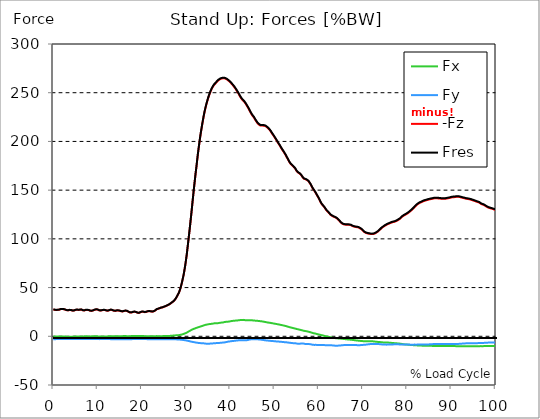
| Category |  Fx |  Fy |  -Fz |  Fres |
|---|---|---|---|---|
| 0.0 | -0.263 | -2.937 | 27.478 | 27.65 |
| 0.167348456675344 | -0.285 | -2.953 | 27.382 | 27.556 |
| 0.334696913350688 | -0.305 | -2.959 | 27.114 | 27.291 |
| 0.5020453700260321 | -0.274 | -2.934 | 26.926 | 27.102 |
| 0.669393826701376 | -0.227 | -2.901 | 26.907 | 27.078 |
| 0.83674228337672 | -0.195 | -2.87 | 27.041 | 27.208 |
| 1.0040907400520642 | -0.202 | -2.847 | 27.119 | 27.282 |
| 1.1621420602454444 | -0.198 | -2.816 | 27.072 | 27.23 |
| 1.3294905169207885 | -0.159 | -2.794 | 27.242 | 27.395 |
| 1.4968389735961325 | -0.131 | -2.794 | 27.544 | 27.693 |
| 1.6641874302714765 | -0.114 | -2.808 | 27.873 | 28.021 |
| 1.8315358869468206 | -0.136 | -2.817 | 27.979 | 28.128 |
| 1.9988843436221646 | -0.165 | -2.829 | 27.942 | 28.094 |
| 2.1662328002975086 | -0.167 | -2.835 | 27.835 | 27.987 |
| 2.333581256972853 | -0.176 | -2.844 | 27.808 | 27.963 |
| 2.5009297136481967 | -0.223 | -2.851 | 27.671 | 27.827 |
| 2.6682781703235405 | -0.298 | -2.855 | 27.35 | 27.51 |
| 2.8356266269988843 | -0.357 | -2.853 | 26.999 | 27.162 |
| 3.002975083674229 | -0.385 | -2.854 | 26.742 | 26.909 |
| 3.1703235403495724 | -0.372 | -2.847 | 26.6 | 26.77 |
| 3.337671997024917 | -0.36 | -2.842 | 26.596 | 26.765 |
| 3.4957233172182973 | -0.36 | -2.853 | 26.795 | 26.965 |
| 3.663071773893641 | -0.363 | -2.867 | 26.975 | 27.145 |
| 3.8304202305689854 | -0.391 | -2.878 | 26.984 | 27.153 |
| 3.997768687244329 | -0.419 | -2.878 | 26.823 | 26.994 |
| 4.165117143919673 | -0.448 | -2.875 | 26.563 | 26.735 |
| 4.332465600595017 | -0.44 | -2.855 | 26.341 | 26.512 |
| 4.499814057270361 | -0.398 | -2.823 | 26.254 | 26.42 |
| 4.667162513945706 | -0.316 | -2.789 | 26.412 | 26.569 |
| 4.834510970621049 | -0.224 | -2.773 | 26.709 | 26.861 |
| 5.001859427296393 | -0.184 | -2.795 | 27.037 | 27.189 |
| 5.169207883971737 | -0.17 | -2.813 | 27.282 | 27.434 |
| 5.336556340647081 | -0.186 | -2.823 | 27.342 | 27.496 |
| 5.503904797322425 | -0.199 | -2.833 | 27.221 | 27.378 |
| 5.671253253997769 | -0.202 | -2.844 | 27.022 | 27.181 |
| 5.82930457419115 | -0.152 | -2.835 | 26.996 | 27.153 |
| 5.996653030866494 | -0.093 | -2.82 | 27.249 | 27.404 |
| 6.164001487541838 | -0.063 | -2.813 | 27.485 | 27.639 |
| 6.331349944217181 | -0.106 | -2.817 | 27.416 | 27.569 |
| 6.498698400892526 | -0.165 | -2.824 | 27.069 | 27.227 |
| 6.66604685756787 | -0.181 | -2.817 | 26.649 | 26.81 |
| 6.833395314243213 | -0.142 | -2.796 | 26.463 | 26.624 |
| 7.000743770918558 | -0.081 | -2.773 | 26.504 | 26.661 |
| 7.168092227593902 | -0.024 | -2.771 | 26.81 | 26.963 |
| 7.335440684269246 | -0.019 | -2.789 | 27.077 | 27.232 |
| 7.50278914094459 | -0.029 | -2.795 | 27.196 | 27.351 |
| 7.6701375976199335 | -0.091 | -2.811 | 27.072 | 27.232 |
| 7.837486054295278 | -0.127 | -2.826 | 26.931 | 27.094 |
| 7.995537374488658 | -0.161 | -2.842 | 26.855 | 27.024 |
| 8.162885831164003 | -0.17 | -2.851 | 26.468 | 26.637 |
| 8.330234287839346 | -0.165 | -2.854 | 26.19 | 26.363 |
| 8.49758274451469 | -0.125 | -2.853 | 26.088 | 26.26 |
| 8.664931201190035 | -0.074 | -2.848 | 26.111 | 26.279 |
| 8.832279657865378 | -0.037 | -2.854 | 26.322 | 26.487 |
| 8.999628114540721 | 0 | -2.851 | 26.531 | 26.692 |
| 9.166976571216066 | 0.052 | -2.85 | 26.848 | 27.006 |
| 9.334325027891412 | 0.088 | -2.847 | 27.206 | 27.363 |
| 9.501673484566755 | 0.086 | -2.854 | 27.4 | 27.555 |
| 9.669021941242098 | 0.075 | -2.847 | 27.556 | 27.709 |
| 9.836370397917442 | 0.034 | -2.86 | 27.58 | 27.736 |
| 10.003718854592787 | -0.049 | -2.889 | 27.423 | 27.586 |
| 10.17106731126813 | -0.146 | -2.917 | 27.046 | 27.215 |
| 10.329118631461512 | -0.199 | -2.92 | 26.647 | 26.822 |
| 10.496467088136853 | -0.199 | -2.912 | 26.454 | 26.631 |
| 10.663815544812199 | -0.183 | -2.904 | 26.382 | 26.559 |
| 10.831164001487544 | -0.158 | -2.889 | 26.491 | 26.667 |
| 10.998512458162887 | -0.134 | -2.889 | 26.704 | 26.878 |
| 11.16586091483823 | -0.118 | -2.898 | 26.959 | 27.133 |
| 11.333209371513574 | -0.133 | -2.9 | 27.013 | 27.189 |
| 11.50055782818892 | -0.145 | -2.888 | 26.932 | 27.106 |
| 11.667906284864264 | -0.156 | -2.889 | 26.912 | 27.084 |
| 11.835254741539607 | -0.177 | -2.892 | 26.706 | 26.881 |
| 12.00260319821495 | -0.176 | -2.907 | 26.412 | 26.59 |
| 12.169951654890292 | -0.147 | -2.907 | 26.249 | 26.428 |
| 12.337300111565641 | -0.081 | -2.9 | 26.24 | 26.416 |
| 12.504648568240984 | -0.032 | -2.886 | 26.422 | 26.594 |
| 12.662699888434362 | 0.022 | -2.888 | 26.746 | 26.914 |
| 12.830048345109708 | 0.044 | -2.913 | 27.091 | 27.26 |
| 12.997396801785053 | 0.038 | -2.938 | 27.279 | 27.448 |
| 13.164745258460396 | 0.015 | -2.954 | 27.15 | 27.323 |
| 13.33209371513574 | -0.031 | -2.991 | 26.882 | 27.063 |
| 13.499442171811083 | -0.063 | -3.027 | 26.525 | 26.715 |
| 13.666790628486426 | -0.053 | -3.04 | 26.221 | 26.416 |
| 13.834139085161771 | -0.019 | -3.038 | 26.068 | 26.264 |
| 14.001487541837117 | 0.018 | -3.034 | 26.062 | 26.258 |
| 14.16883599851246 | 0.046 | -3.034 | 26.217 | 26.412 |
| 14.336184455187803 | 0.059 | -3.044 | 26.441 | 26.636 |
| 14.503532911863147 | 0.043 | -3.049 | 26.515 | 26.711 |
| 14.670881368538492 | 0.021 | -3.05 | 26.425 | 26.622 |
| 14.828932688731873 | 0.007 | -3.066 | 26.381 | 26.581 |
| 14.996281145407215 | -0.003 | -3.056 | 26.218 | 26.417 |
| 15.163629602082558 | -0.01 | -3.055 | 25.931 | 26.13 |
| 15.330978058757903 | 0.029 | -3.047 | 25.631 | 25.832 |
| 15.498326515433247 | 0.068 | -3.021 | 25.481 | 25.676 |
| 15.665674972108594 | 0.131 | -3 | 25.524 | 25.714 |
| 15.833023428783937 | 0.187 | -2.975 | 25.712 | 25.895 |
| 16.00037188545928 | 0.254 | -2.976 | 25.988 | 26.168 |
| 16.167720342134626 | 0.248 | -3.012 | 26.212 | 26.394 |
| 16.335068798809967 | 0.211 | -3.044 | 26.236 | 26.422 |
| 16.502417255485312 | 0.158 | -3.08 | 26.056 | 26.246 |
| 16.669765712160658 | 0.136 | -3.106 | 25.945 | 26.139 |
| 16.837114168836 | 0.086 | -3.115 | 25.581 | 25.78 |
| 17.004462625511344 | 0.034 | -3.112 | 25.115 | 25.319 |
| 17.16251394570472 | 0.022 | -3.09 | 24.673 | 24.879 |
| 17.32986240238007 | 0.053 | -3.055 | 24.379 | 24.583 |
| 17.497210859055414 | 0.131 | -2.999 | 24.237 | 24.435 |
| 17.664559315730756 | 0.214 | -2.945 | 24.369 | 24.558 |
| 17.8319077724061 | 0.301 | -2.903 | 24.658 | 24.839 |
| 17.999256229081443 | 0.379 | -2.879 | 24.963 | 25.14 |
| 18.166604685756788 | 0.382 | -2.888 | 25.174 | 25.35 |
| 18.333953142432133 | 0.36 | -2.895 | 25.23 | 25.407 |
| 18.501301599107478 | 0.317 | -2.904 | 25.152 | 25.329 |
| 18.668650055782823 | 0.251 | -2.914 | 24.885 | 25.066 |
| 18.835998512458165 | 0.199 | -2.909 | 24.527 | 24.709 |
| 19.00334696913351 | 0.159 | -2.891 | 24.161 | 24.344 |
| 19.170695425808855 | 0.176 | -2.863 | 23.96 | 24.142 |
| 19.338043882484197 | 0.233 | -2.823 | 23.972 | 24.147 |
| 19.496095202677576 | 0.289 | -2.798 | 24.246 | 24.419 |
| 19.66344365935292 | 0.341 | -2.785 | 24.605 | 24.773 |
| 19.830792116028263 | 0.351 | -2.813 | 25.012 | 25.181 |
| 19.998140572703612 | 0.33 | -2.832 | 25.224 | 25.395 |
| 20.165489029378953 | 0.274 | -2.857 | 25.313 | 25.485 |
| 20.3328374860543 | 0.211 | -2.879 | 25.173 | 25.35 |
| 20.500185942729644 | 0.165 | -2.881 | 24.95 | 25.127 |
| 20.667534399404985 | 0.119 | -2.882 | 24.726 | 24.906 |
| 20.83488285608033 | 0.131 | -2.881 | 24.796 | 24.975 |
| 21.002231312755672 | 0.143 | -2.895 | 25.038 | 25.217 |
| 21.16957976943102 | 0.147 | -2.929 | 25.341 | 25.521 |
| 21.336928226106362 | 0.134 | -2.971 | 25.612 | 25.795 |
| 21.504276682781704 | 0.096 | -3.006 | 25.736 | 25.923 |
| 21.67162513945705 | 0.04 | -3.025 | 25.696 | 25.888 |
| 21.82967645965043 | 0.004 | -3.043 | 25.659 | 25.853 |
| 21.997024916325774 | -0.028 | -3.058 | 25.58 | 25.774 |
| 22.16437337300112 | -0.055 | -3.055 | 25.381 | 25.578 |
| 22.33172182967646 | -0.063 | -3.046 | 25.257 | 25.453 |
| 22.499070286351806 | -0.004 | -3.015 | 25.391 | 25.581 |
| 22.666418743027148 | 0.056 | -2.991 | 25.588 | 25.774 |
| 22.833767199702496 | 0.108 | -2.981 | 25.9 | 26.083 |
| 23.00111565637784 | 0.155 | -2.984 | 26.409 | 26.587 |
| 23.168464113053183 | 0.183 | -3.015 | 27.075 | 27.254 |
| 23.335812569728528 | 0.168 | -3.044 | 27.631 | 27.811 |
| 23.50316102640387 | 0.161 | -3.059 | 28.024 | 28.202 |
| 23.670509483079215 | 0.125 | -3.068 | 28.211 | 28.391 |
| 23.83785793975456 | 0.077 | -3.077 | 28.327 | 28.51 |
| 23.995909259947936 | 0.083 | -3.088 | 28.661 | 28.842 |
| 24.163257716623285 | 0.081 | -3.118 | 29.117 | 29.301 |
| 24.330606173298627 | 0.105 | -3.114 | 29.36 | 29.543 |
| 24.49795462997397 | 0.133 | -3.103 | 29.468 | 29.649 |
| 24.665303086649313 | 0.161 | -3.093 | 29.578 | 29.758 |
| 24.83265154332466 | 0.193 | -3.1 | 29.904 | 30.086 |
| 25.0 | 0.235 | -3.099 | 30.274 | 30.453 |
| 25.167348456675345 | 0.265 | -3.09 | 30.581 | 30.758 |
| 25.334696913350694 | 0.285 | -3.084 | 30.801 | 30.976 |
| 25.502045370026035 | 0.282 | -3.103 | 31.285 | 31.46 |
| 25.669393826701377 | 0.283 | -3.088 | 31.522 | 31.695 |
| 25.836742283376722 | 0.298 | -3.078 | 31.845 | 32.016 |
| 26.004090740052067 | 0.326 | -3.075 | 32.245 | 32.416 |
| 26.17143919672741 | 0.353 | -3.074 | 32.647 | 32.819 |
| 26.329490516920792 | 0.401 | -3.072 | 33.096 | 33.267 |
| 26.49683897359613 | 0.465 | -3.068 | 33.621 | 33.794 |
| 26.66418743027148 | 0.535 | -3.066 | 34.257 | 34.429 |
| 26.831535886946828 | 0.609 | -3.063 | 34.805 | 34.978 |
| 26.998884343622166 | 0.68 | -3.062 | 35.347 | 35.521 |
| 27.166232800297514 | 0.752 | -3.072 | 35.971 | 36.146 |
| 27.333581256972852 | 0.823 | -3.09 | 36.634 | 36.811 |
| 27.5009297136482 | 0.894 | -3.109 | 37.326 | 37.504 |
| 27.668278170323543 | 0.947 | -3.142 | 38.637 | 38.817 |
| 27.835626626998888 | 0.954 | -3.176 | 39.937 | 40.118 |
| 28.002975083674233 | 1.009 | -3.202 | 41.248 | 41.431 |
| 28.170323540349575 | 1.09 | -3.23 | 42.743 | 42.925 |
| 28.33767199702492 | 1.171 | -3.28 | 44.122 | 44.307 |
| 28.50502045370026 | 1.283 | -3.357 | 46.062 | 46.251 |
| 28.663071773893645 | 1.45 | -3.394 | 48.255 | 48.448 |
| 28.830420230568986 | 1.586 | -3.493 | 50.776 | 50.975 |
| 28.99776868724433 | 1.754 | -3.593 | 53.735 | 53.938 |
| 29.165117143919673 | 1.95 | -3.684 | 57.049 | 57.26 |
| 29.33246560059502 | 2.233 | -3.733 | 60.453 | 60.673 |
| 29.499814057270367 | 2.468 | -3.876 | 64.19 | 64.42 |
| 29.66716251394571 | 2.755 | -3.997 | 68.481 | 68.723 |
| 29.834510970621054 | 3.086 | -4.111 | 73.208 | 73.46 |
| 30.00185942729639 | 3.42 | -4.257 | 78.478 | 78.74 |
| 30.169207883971744 | 3.801 | -4.376 | 83.973 | 84.249 |
| 30.33655634064708 | 4.217 | -4.59 | 90.54 | 90.832 |
| 30.50390479732243 | 4.724 | -4.726 | 97.075 | 97.391 |
| 30.671253253997772 | 5.152 | -4.894 | 103.605 | 103.944 |
| 30.829304574191156 | 5.599 | -5.086 | 110.23 | 110.591 |
| 30.996653030866494 | 5.956 | -5.327 | 117.239 | 117.619 |
| 31.164001487541842 | 6.44 | -5.463 | 124.364 | 124.765 |
| 31.331349944217187 | 6.839 | -5.628 | 131.677 | 132.093 |
| 31.498698400892525 | 7.186 | -5.796 | 139.223 | 139.649 |
| 31.666046857567874 | 7.485 | -5.932 | 146.462 | 146.894 |
| 31.833395314243212 | 7.77 | -6.058 | 153.58 | 154.018 |
| 32.00074377091856 | 7.997 | -6.204 | 160.401 | 160.845 |
| 32.1680922275939 | 8.311 | -6.358 | 167.171 | 167.624 |
| 32.33544068426925 | 8.646 | -6.479 | 173.232 | 173.696 |
| 32.50278914094459 | 8.906 | -6.599 | 179.901 | 180.37 |
| 32.670137597619934 | 9.146 | -6.733 | 186.398 | 186.87 |
| 32.83748605429528 | 9.369 | -6.855 | 192.323 | 192.802 |
| 33.004834510970625 | 9.637 | -6.937 | 197.923 | 198.41 |
| 33.162885831164004 | 9.912 | -7.018 | 203.45 | 203.942 |
| 33.33023428783935 | 10.119 | -7.047 | 208.472 | 208.965 |
| 33.497582744514695 | 10.319 | -7.071 | 212.993 | 213.488 |
| 33.664931201190036 | 10.581 | -7.068 | 217.55 | 218.052 |
| 33.83227965786538 | 10.863 | -7.114 | 221.92 | 222.432 |
| 33.99962811454073 | 11.162 | -7.242 | 226.009 | 226.535 |
| 34.16697657121607 | 11.454 | -7.404 | 229.813 | 230.355 |
| 34.33432502789141 | 11.683 | -7.491 | 233.112 | 233.665 |
| 34.50167348456676 | 11.863 | -7.571 | 236.223 | 236.783 |
| 34.6690219412421 | 12.001 | -7.609 | 239.137 | 239.701 |
| 34.83637039791744 | 12.142 | -7.621 | 241.836 | 242.403 |
| 35.00371885459279 | 12.308 | -7.627 | 244.37 | 244.94 |
| 35.17106731126814 | 12.426 | -7.6 | 246.678 | 247.249 |
| 35.338415767943474 | 12.543 | -7.56 | 248.823 | 249.395 |
| 35.49646708813686 | 12.643 | -7.499 | 250.779 | 251.353 |
| 35.6638155448122 | 12.737 | -7.429 | 252.584 | 253.156 |
| 35.831164001487544 | 12.833 | -7.355 | 254.178 | 254.751 |
| 35.998512458162885 | 12.965 | -7.31 | 255.578 | 256.153 |
| 36.165860914838234 | 13.117 | -7.265 | 256.853 | 257.432 |
| 36.333209371513576 | 13.248 | -7.201 | 257.994 | 258.575 |
| 36.50055782818892 | 13.366 | -7.131 | 258.944 | 259.529 |
| 36.667906284864266 | 13.324 | -7.038 | 259.591 | 260.17 |
| 36.83525474153961 | 13.286 | -6.993 | 260.379 | 260.95 |
| 37.002603198214956 | 13.322 | -6.976 | 261.388 | 261.956 |
| 37.1699516548903 | 13.422 | -6.912 | 262.198 | 262.767 |
| 37.337300111565646 | 13.541 | -6.851 | 262.853 | 263.425 |
| 37.50464856824098 | 13.678 | -6.786 | 263.372 | 263.945 |
| 37.66269988843437 | 13.866 | -6.757 | 263.86 | 264.441 |
| 37.83004834510971 | 14.003 | -6.696 | 264.226 | 264.81 |
| 37.99739680178505 | 14.049 | -6.591 | 264.51 | 265.093 |
| 38.16474525846039 | 14.08 | -6.507 | 264.72 | 265.299 |
| 38.33209371513574 | 14.174 | -6.456 | 264.848 | 265.428 |
| 38.49944217181109 | 14.413 | -6.383 | 264.898 | 265.485 |
| 38.666790628486424 | 14.577 | -6.301 | 264.792 | 265.385 |
| 38.83413908516178 | 14.714 | -6.168 | 264.569 | 265.165 |
| 39.001487541837115 | 14.817 | -6.016 | 264.242 | 264.839 |
| 39.16883599851246 | 14.873 | -5.847 | 263.811 | 264.407 |
| 39.336184455187805 | 14.919 | -5.701 | 263.354 | 263.95 |
| 39.503532911863154 | 14.954 | -5.471 | 262.779 | 263.372 |
| 39.670881368538495 | 15.094 | -5.339 | 262.134 | 262.73 |
| 39.83822982521384 | 15.264 | -5.294 | 261.487 | 262.09 |
| 39.996281145407224 | 15.409 | -5.193 | 260.764 | 261.373 |
| 40.163629602082565 | 15.556 | -5.047 | 259.903 | 260.518 |
| 40.33097805875791 | 15.684 | -4.947 | 259.043 | 259.664 |
| 40.498326515433256 | 15.805 | -4.858 | 258.19 | 258.816 |
| 40.6656749721086 | 15.886 | -4.788 | 257.252 | 257.881 |
| 40.83302342878393 | 15.951 | -4.724 | 256.277 | 256.91 |
| 41.00037188545929 | 16.016 | -4.65 | 255.285 | 255.92 |
| 41.16772034213463 | 16.086 | -4.528 | 254.187 | 254.827 |
| 41.33506879880997 | 16.156 | -4.409 | 253.012 | 253.658 |
| 41.50241725548531 | 16.22 | -4.332 | 251.811 | 252.465 |
| 41.66976571216066 | 16.295 | -4.258 | 250.605 | 251.264 |
| 41.837114168836 | 16.37 | -4.167 | 249.353 | 250.018 |
| 42.004462625511344 | 16.524 | -4.055 | 247.891 | 248.565 |
| 42.17181108218669 | 16.609 | -3.993 | 246.541 | 247.223 |
| 42.32986240238007 | 16.668 | -3.981 | 245.223 | 245.91 |
| 42.497210859055414 | 16.718 | -3.969 | 243.993 | 244.683 |
| 42.66455931573076 | 16.789 | -3.997 | 243.13 | 243.826 |
| 42.831907772406105 | 16.87 | -4.04 | 242.211 | 242.914 |
| 42.999256229081446 | 16.845 | -4.074 | 241.441 | 242.143 |
| 43.16660468575679 | 16.695 | -4.08 | 240.655 | 241.344 |
| 43.33395314243214 | 16.569 | -4.093 | 239.785 | 240.465 |
| 43.50130159910748 | 16.55 | -4.133 | 238.553 | 239.235 |
| 43.66865005578282 | 16.469 | -4.081 | 237.299 | 237.976 |
| 43.83599851245817 | 16.398 | -3.945 | 236.037 | 236.709 |
| 44.00334696913351 | 16.355 | -3.773 | 234.796 | 235.465 |
| 44.17069542580886 | 16.369 | -3.575 | 233.401 | 234.069 |
| 44.3380438824842 | 16.413 | -3.376 | 231.957 | 232.627 |
| 44.49609520267758 | 16.42 | -3.215 | 230.506 | 231.176 |
| 44.66344365935292 | 16.369 | -3.114 | 229.043 | 229.711 |
| 44.83079211602827 | 16.358 | -3.037 | 227.761 | 228.431 |
| 44.99814057270361 | 16.357 | -2.985 | 226.552 | 227.224 |
| 45.16548902937895 | 16.294 | -3.056 | 225.594 | 226.265 |
| 45.332837486054295 | 16.195 | -3.137 | 224.69 | 225.357 |
| 45.500185942729644 | 16.097 | -3.189 | 223.338 | 224.001 |
| 45.66753439940499 | 16.046 | -3.102 | 222.086 | 222.746 |
| 45.83488285608033 | 15.991 | -3.062 | 220.895 | 221.556 |
| 46.00223131275568 | 15.929 | -3.052 | 219.742 | 220.401 |
| 46.16957976943102 | 15.851 | -3.108 | 218.673 | 219.33 |
| 46.336928226106366 | 15.767 | -3.18 | 217.814 | 218.469 |
| 46.50427668278171 | 15.673 | -3.245 | 217.235 | 217.885 |
| 46.671625139457056 | 15.58 | -3.299 | 216.705 | 217.353 |
| 46.829676459650436 | 15.487 | -3.363 | 216.251 | 216.892 |
| 46.99702491632577 | 15.394 | -3.487 | 216.245 | 216.882 |
| 47.16437337300112 | 15.289 | -3.606 | 216.271 | 216.904 |
| 47.33172182967646 | 15.173 | -3.723 | 216.333 | 216.959 |
| 47.49907028635181 | 15.037 | -3.832 | 216.183 | 216.802 |
| 47.66641874302716 | 14.888 | -3.945 | 216.018 | 216.631 |
| 47.83376719970249 | 14.739 | -4.069 | 215.969 | 216.575 |
| 48.001115656377834 | 14.587 | -4.174 | 215.608 | 216.208 |
| 48.16846411305319 | 14.434 | -4.268 | 215.074 | 215.668 |
| 48.33581256972853 | 14.28 | -4.363 | 214.54 | 215.128 |
| 48.50316102640387 | 14.149 | -4.428 | 213.814 | 214.4 |
| 48.67050948307921 | 14.025 | -4.487 | 213.043 | 213.625 |
| 48.837857939754564 | 13.912 | -4.572 | 212.196 | 212.777 |
| 49.005206396429905 | 13.805 | -4.674 | 211.313 | 211.892 |
| 49.163257716623285 | 13.656 | -4.774 | 210.195 | 210.774 |
| 49.33060617329863 | 13.506 | -4.805 | 208.909 | 209.481 |
| 49.49795462997397 | 13.378 | -4.833 | 207.795 | 208.361 |
| 49.66530308664932 | 13.24 | -4.904 | 206.724 | 207.288 |
| 49.832651543324666 | 13.081 | -5.015 | 205.642 | 206.201 |
| 50.0 | 12.96 | -5.08 | 204.428 | 204.982 |
| 50.16734845667534 | 12.835 | -5.15 | 203.236 | 203.788 |
| 50.33469691335069 | 12.698 | -5.23 | 202.062 | 202.612 |
| 50.50204537002604 | 12.54 | -5.298 | 200.773 | 201.316 |
| 50.66939382670139 | 12.392 | -5.348 | 199.493 | 200.028 |
| 50.836742283376715 | 12.236 | -5.435 | 198.271 | 198.804 |
| 51.00409074005207 | 12.105 | -5.462 | 197.066 | 197.596 |
| 51.17143919672741 | 11.959 | -5.522 | 195.997 | 196.522 |
| 51.32949051692079 | 11.796 | -5.59 | 194.642 | 195.161 |
| 51.496838973596134 | 11.606 | -5.677 | 193.347 | 193.857 |
| 51.66418743027148 | 11.426 | -5.746 | 192.134 | 192.637 |
| 51.831535886946824 | 11.24 | -5.838 | 190.999 | 191.496 |
| 51.99888434362217 | 11.125 | -5.87 | 189.869 | 190.363 |
| 52.16623280029752 | 10.962 | -5.966 | 188.65 | 189.139 |
| 52.33358125697285 | 10.761 | -6.091 | 187.392 | 187.876 |
| 52.5009297136482 | 10.578 | -6.114 | 186.174 | 186.65 |
| 52.668278170323546 | 10.358 | -6.174 | 184.696 | 185.164 |
| 52.835626626998895 | 10.136 | -6.289 | 183.308 | 183.77 |
| 53.00297508367424 | 9.909 | -6.391 | 181.959 | 182.412 |
| 53.17032354034958 | 9.684 | -6.478 | 180.563 | 181.007 |
| 53.33767199702492 | 9.431 | -6.588 | 179.037 | 179.469 |
| 53.50502045370027 | 9.237 | -6.684 | 177.894 | 178.322 |
| 53.663071773893655 | 9.053 | -6.779 | 176.845 | 177.27 |
| 53.83042023056899 | 8.86 | -6.873 | 176.174 | 176.596 |
| 53.99776868724433 | 8.686 | -6.954 | 175.41 | 175.83 |
| 54.16511714391967 | 8.506 | -7.069 | 174.553 | 174.976 |
| 54.33246560059503 | 8.314 | -7.115 | 173.858 | 174.277 |
| 54.49981405727037 | 8.124 | -7.133 | 173.114 | 173.527 |
| 54.667162513945705 | 7.935 | -7.159 | 172.261 | 172.67 |
| 54.834510970621054 | 7.726 | -7.227 | 170.985 | 171.386 |
| 55.0018594272964 | 7.494 | -7.413 | 169.625 | 170.021 |
| 55.169207883971744 | 7.302 | -7.571 | 168.646 | 169.044 |
| 55.336556340647086 | 7.15 | -7.701 | 168.015 | 168.416 |
| 55.50390479732243 | 6.948 | -7.704 | 167.606 | 168.001 |
| 55.671253253997776 | 6.782 | -7.647 | 167.146 | 167.534 |
| 55.83860171067312 | 6.643 | -7.55 | 166.645 | 167.025 |
| 55.9966530308665 | 6.442 | -7.438 | 165.701 | 166.071 |
| 56.16400148754184 | 6.221 | -7.397 | 164.504 | 164.867 |
| 56.33134994421718 | 5.994 | -7.361 | 163.41 | 163.764 |
| 56.498698400892536 | 5.805 | -7.422 | 162.413 | 162.768 |
| 56.66604685756788 | 5.622 | -7.562 | 161.686 | 162.046 |
| 56.83339531424321 | 5.462 | -7.783 | 161.348 | 161.715 |
| 57.00074377091856 | 5.344 | -7.912 | 161.189 | 161.562 |
| 57.16809222759391 | 5.218 | -7.934 | 160.892 | 161.264 |
| 57.33544068426925 | 5.08 | -7.879 | 160.441 | 160.808 |
| 57.5027891409446 | 4.904 | -7.879 | 159.904 | 160.27 |
| 57.670137597619934 | 4.72 | -7.894 | 159.304 | 159.673 |
| 57.83748605429528 | 4.518 | -7.976 | 158.206 | 158.575 |
| 58.004834510970625 | 4.316 | -8.108 | 157.137 | 157.512 |
| 58.16288583116401 | 4.094 | -8.229 | 155.925 | 156.302 |
| 58.330234287839346 | 3.842 | -8.345 | 154.463 | 154.841 |
| 58.497582744514695 | 3.569 | -8.518 | 153 | 153.379 |
| 58.66493120119004 | 3.316 | -8.712 | 151.65 | 152.029 |
| 58.832279657865385 | 3.167 | -8.836 | 150.56 | 150.942 |
| 58.999628114540734 | 2.999 | -8.836 | 149.419 | 149.801 |
| 59.16697657121607 | 2.829 | -8.836 | 148.279 | 148.659 |
| 59.33432502789142 | 2.678 | -8.792 | 147.009 | 147.383 |
| 59.50167348456676 | 2.469 | -8.789 | 145.645 | 146.012 |
| 59.66902194124211 | 2.227 | -8.873 | 144.271 | 144.64 |
| 59.83637039791745 | 2.047 | -8.963 | 143.078 | 143.453 |
| 60.00371885459278 | 1.867 | -8.987 | 141.615 | 141.99 |
| 60.17106731126813 | 1.733 | -8.969 | 140.137 | 140.51 |
| 60.33841576794349 | 1.501 | -8.962 | 138.499 | 138.87 |
| 60.49646708813685 | 1.311 | -8.904 | 137.052 | 137.42 |
| 60.6638155448122 | 1.145 | -8.845 | 135.757 | 136.124 |
| 60.831164001487544 | 1.013 | -8.792 | 134.83 | 135.195 |
| 60.99851245816289 | 0.801 | -8.867 | 133.978 | 134.342 |
| 61.16586091483824 | 0.574 | -8.969 | 133.14 | 133.506 |
| 61.333209371513576 | 0.322 | -9.072 | 132.119 | 132.487 |
| 61.50055782818892 | 0.147 | -9.125 | 130.932 | 131.302 |
| 61.667906284864266 | -0.058 | -9.133 | 129.791 | 130.161 |
| 61.835254741539615 | -0.208 | -9.13 | 128.881 | 129.251 |
| 62.002603198214956 | -0.341 | -9.145 | 128.084 | 128.457 |
| 62.16995165489029 | -0.54 | -9.183 | 127.285 | 127.659 |
| 62.33730011156564 | -0.709 | -9.226 | 126.532 | 126.912 |
| 62.504648568240995 | -0.836 | -9.243 | 125.602 | 125.988 |
| 62.67199702491633 | -0.993 | -9.227 | 124.705 | 125.091 |
| 62.83004834510971 | -1.149 | -9.23 | 124.131 | 124.521 |
| 62.99739680178505 | -1.299 | -9.301 | 123.678 | 124.074 |
| 63.1647452584604 | -1.447 | -9.385 | 123.221 | 123.622 |
| 63.33209371513575 | -1.591 | -9.465 | 122.858 | 123.268 |
| 63.4994421718111 | -1.735 | -9.544 | 122.516 | 122.934 |
| 63.666790628486424 | -1.86 | -9.619 | 122.211 | 122.636 |
| 63.83413908516177 | -1.947 | -9.681 | 121.906 | 122.338 |
| 64.00148754183712 | -2.028 | -9.72 | 121.37 | 121.807 |
| 64.16883599851248 | -2.1 | -9.692 | 120.714 | 121.152 |
| 64.3361844551878 | -2.149 | -9.624 | 120.137 | 120.574 |
| 64.50353291186315 | -2.192 | -9.559 | 119.388 | 119.823 |
| 64.6708813685385 | -2.24 | -9.499 | 118.515 | 118.947 |
| 64.83822982521384 | -2.348 | -9.447 | 117.677 | 118.108 |
| 65.00557828188919 | -2.444 | -9.37 | 116.794 | 117.221 |
| 65.16362960208257 | -2.509 | -9.26 | 116.075 | 116.497 |
| 65.3309780587579 | -2.609 | -9.187 | 115.544 | 115.963 |
| 65.49832651543326 | -2.712 | -9.103 | 115.165 | 115.58 |
| 65.6656749721086 | -2.791 | -9.047 | 114.886 | 115.299 |
| 65.83302342878395 | -2.854 | -9.01 | 114.696 | 115.108 |
| 66.00037188545929 | -2.928 | -8.981 | 114.617 | 115.027 |
| 66.16772034213463 | -3.032 | -8.945 | 114.617 | 115.027 |
| 66.33506879880998 | -3.127 | -8.953 | 114.519 | 114.931 |
| 66.50241725548531 | -3.187 | -8.941 | 114.466 | 114.878 |
| 66.66976571216065 | -3.257 | -8.92 | 114.476 | 114.888 |
| 66.83711416883601 | -3.32 | -8.904 | 114.466 | 114.878 |
| 67.00446262551135 | -3.378 | -8.9 | 114.406 | 114.819 |
| 67.1718110821867 | -3.45 | -8.912 | 114.211 | 114.627 |
| 67.32986240238007 | -3.535 | -8.928 | 113.962 | 114.383 |
| 67.49721085905541 | -3.655 | -8.944 | 113.501 | 113.929 |
| 67.66455931573076 | -3.723 | -8.971 | 113.038 | 113.472 |
| 67.83190777240611 | -3.822 | -8.954 | 112.746 | 113.183 |
| 67.99925622908145 | -3.938 | -8.925 | 112.555 | 112.994 |
| 68.16660468575678 | -4.066 | -8.951 | 112.395 | 112.842 |
| 68.33395314243214 | -4.183 | -8.984 | 112.235 | 112.689 |
| 68.50130159910749 | -4.224 | -9.046 | 112.072 | 112.534 |
| 68.66865005578282 | -4.286 | -9.088 | 111.972 | 112.441 |
| 68.83599851245816 | -4.375 | -9.108 | 111.898 | 112.373 |
| 69.00334696913352 | -4.512 | -9.105 | 111.674 | 112.156 |
| 69.17069542580886 | -4.553 | -9.096 | 111.295 | 111.78 |
| 69.3380438824842 | -4.67 | -9.108 | 110.798 | 111.292 |
| 69.50539233915956 | -4.76 | -9.024 | 110.324 | 110.819 |
| 69.66344365935292 | -4.888 | -8.972 | 109.829 | 110.326 |
| 69.83079211602826 | -4.951 | -8.913 | 109.088 | 109.587 |
| 69.99814057270362 | -4.982 | -8.845 | 108.351 | 108.85 |
| 70.16548902937896 | -5.003 | -8.785 | 107.521 | 108.019 |
| 70.33283748605429 | -5.001 | -8.715 | 106.892 | 107.389 |
| 70.50018594272964 | -5.012 | -8.649 | 106.442 | 106.935 |
| 70.667534399405 | -5.032 | -8.572 | 106.106 | 106.596 |
| 70.83488285608033 | -4.993 | -8.463 | 105.802 | 106.28 |
| 71.00223131275568 | -4.976 | -8.354 | 105.621 | 106.09 |
| 71.16957976943102 | -5 | -8.233 | 105.516 | 105.975 |
| 71.33692822610637 | -5.027 | -8.134 | 105.341 | 105.794 |
| 71.50427668278171 | -5.038 | -8.069 | 105.125 | 105.574 |
| 71.67162513945706 | -5.05 | -8.013 | 105.049 | 105.493 |
| 71.8389735961324 | -5.08 | -7.945 | 104.993 | 105.432 |
| 71.99702491632577 | -5.133 | -7.898 | 104.907 | 105.345 |
| 72.16437337300113 | -5.189 | -7.861 | 104.833 | 105.271 |
| 72.33172182967647 | -5.237 | -7.819 | 104.978 | 105.414 |
| 72.49907028635181 | -5.335 | -7.829 | 105.242 | 105.683 |
| 72.66641874302715 | -5.422 | -7.829 | 105.515 | 105.959 |
| 72.8337671997025 | -5.478 | -7.798 | 105.823 | 106.267 |
| 73.00111565637783 | -5.586 | -7.847 | 106.351 | 106.801 |
| 73.16846411305319 | -5.681 | -7.888 | 106.853 | 107.307 |
| 73.33581256972853 | -5.77 | -7.92 | 107.33 | 107.792 |
| 73.50316102640387 | -5.811 | -7.975 | 107.962 | 108.426 |
| 73.67050948307921 | -5.867 | -8.044 | 108.664 | 109.134 |
| 73.83785793975457 | -5.984 | -8.155 | 109.534 | 110.015 |
| 74.00520639642991 | -6.009 | -8.214 | 110.17 | 110.653 |
| 74.16325771662328 | -6.099 | -8.291 | 110.942 | 111.434 |
| 74.33060617329863 | -6.209 | -8.354 | 111.572 | 112.072 |
| 74.49795462997398 | -6.283 | -8.394 | 112.118 | 112.622 |
| 74.66530308664932 | -6.317 | -8.468 | 112.569 | 113.08 |
| 74.83265154332466 | -6.395 | -8.525 | 113.063 | 113.58 |
| 75.00000000000001 | -6.429 | -8.546 | 113.617 | 114.136 |
| 75.16734845667534 | -6.454 | -8.622 | 114.021 | 114.546 |
| 75.3346969133507 | -6.471 | -8.572 | 114.485 | 115.007 |
| 75.50204537002605 | -6.46 | -8.484 | 114.886 | 115.401 |
| 75.66939382670138 | -6.466 | -8.426 | 115.251 | 115.763 |
| 75.83674228337672 | -6.499 | -8.413 | 115.587 | 116.099 |
| 76.00409074005208 | -6.556 | -8.429 | 115.839 | 116.355 |
| 76.17143919672742 | -6.634 | -8.444 | 116.184 | 116.704 |
| 76.33878765340276 | -6.723 | -8.426 | 116.547 | 117.068 |
| 76.49683897359614 | -6.795 | -8.392 | 116.789 | 117.31 |
| 76.66418743027148 | -6.886 | -8.326 | 117.055 | 117.577 |
| 76.83153588694682 | -6.945 | -8.305 | 117.233 | 117.757 |
| 76.99888434362218 | -7 | -8.292 | 117.4 | 117.926 |
| 77.16623280029752 | -7.052 | -8.283 | 117.59 | 118.119 |
| 77.33358125697285 | -7.097 | -8.288 | 117.854 | 118.386 |
| 77.5009297136482 | -7.162 | -8.279 | 118.206 | 118.743 |
| 77.66827817032356 | -7.236 | -8.264 | 118.643 | 119.181 |
| 77.83562662699889 | -7.319 | -8.279 | 119.044 | 119.586 |
| 78.00297508367423 | -7.397 | -8.288 | 119.475 | 120.022 |
| 78.17032354034959 | -7.466 | -8.332 | 119.857 | 120.409 |
| 78.33767199702493 | -7.546 | -8.332 | 120.462 | 121.016 |
| 78.50502045370027 | -7.628 | -8.336 | 121.14 | 121.696 |
| 78.67236891037561 | -7.786 | -8.357 | 121.982 | 122.546 |
| 78.83042023056899 | -7.938 | -8.358 | 122.711 | 123.282 |
| 78.99776868724433 | -8.087 | -8.357 | 123.226 | 123.802 |
| 79.16511714391969 | -8.236 | -8.383 | 123.729 | 124.314 |
| 79.33246560059503 | -8.285 | -8.398 | 124.142 | 124.729 |
| 79.49981405727036 | -8.357 | -8.398 | 124.59 | 125.18 |
| 79.66716251394571 | -8.432 | -8.416 | 125.021 | 125.615 |
| 79.83451097062107 | -8.465 | -8.454 | 125.431 | 126.028 |
| 80.00185942729641 | -8.525 | -8.481 | 125.922 | 126.524 |
| 80.16920788397174 | -8.593 | -8.507 | 126.431 | 127.035 |
| 80.33655634064709 | -8.659 | -8.515 | 126.976 | 127.584 |
| 80.50390479732243 | -8.742 | -8.541 | 127.559 | 128.17 |
| 80.67125325399778 | -8.832 | -8.581 | 128.217 | 128.833 |
| 80.83860171067312 | -8.881 | -8.622 | 128.83 | 129.45 |
| 80.99665303086651 | -8.948 | -8.622 | 129.509 | 130.13 |
| 81.16400148754184 | -9.034 | -8.642 | 130.214 | 130.839 |
| 81.3313499442172 | -9.081 | -8.63 | 131.007 | 131.633 |
| 81.49869840089255 | -9.127 | -8.575 | 131.77 | 132.392 |
| 81.66604685756786 | -9.18 | -8.527 | 132.555 | 133.173 |
| 81.83339531424322 | -9.229 | -8.58 | 133.389 | 134.012 |
| 82.00074377091858 | -9.277 | -8.596 | 134.165 | 134.789 |
| 82.16809222759392 | -9.314 | -8.553 | 134.869 | 135.49 |
| 82.33544068426926 | -9.355 | -8.524 | 135.465 | 136.086 |
| 82.50278914094459 | -9.373 | -8.521 | 135.988 | 136.609 |
| 82.67013759761994 | -9.386 | -8.519 | 136.501 | 137.121 |
| 82.83748605429528 | -9.417 | -8.481 | 136.925 | 137.543 |
| 83.00483451097062 | -9.454 | -8.456 | 137.254 | 137.872 |
| 83.17218296764597 | -9.522 | -8.473 | 137.609 | 138.232 |
| 83.33023428783935 | -9.599 | -8.499 | 137.91 | 138.54 |
| 83.4975827445147 | -9.636 | -8.416 | 138.335 | 138.96 |
| 83.66493120119004 | -9.612 | -8.392 | 138.692 | 139.314 |
| 83.83227965786537 | -9.658 | -8.401 | 138.929 | 139.553 |
| 83.99962811454073 | -9.704 | -8.397 | 139.173 | 139.799 |
| 84.16697657121607 | -9.702 | -8.412 | 139.379 | 140.006 |
| 84.33432502789142 | -9.718 | -8.382 | 139.609 | 140.235 |
| 84.50167348456677 | -9.773 | -8.378 | 139.866 | 140.493 |
| 84.6690219412421 | -9.816 | -8.373 | 140.068 | 140.696 |
| 84.83637039791745 | -9.82 | -8.35 | 140.248 | 140.878 |
| 85.0037188545928 | -9.813 | -8.285 | 140.488 | 141.114 |
| 85.17106731126813 | -9.786 | -8.201 | 140.705 | 141.324 |
| 85.33841576794349 | -9.785 | -8.149 | 140.794 | 141.41 |
| 85.50576422461883 | -9.813 | -8.124 | 140.892 | 141.51 |
| 85.66381554481221 | -9.855 | -8.1 | 141.08 | 141.699 |
| 85.83116400148755 | -9.909 | -8.012 | 141.286 | 141.904 |
| 85.99851245816289 | -9.9 | -7.962 | 141.459 | 142.074 |
| 86.16586091483823 | -9.888 | -7.914 | 141.63 | 142.242 |
| 86.33320937151358 | -9.892 | -7.904 | 141.69 | 142.304 |
| 86.50055782818893 | -9.888 | -7.903 | 141.723 | 142.336 |
| 86.66790628486427 | -9.85 | -7.903 | 141.674 | 142.285 |
| 86.83525474153961 | -9.872 | -7.894 | 141.583 | 142.193 |
| 87.00260319821496 | -9.898 | -7.898 | 141.515 | 142.127 |
| 87.16995165489031 | -9.91 | -7.91 | 141.457 | 142.069 |
| 87.33730011156564 | -9.922 | -7.904 | 141.383 | 141.997 |
| 87.504648568241 | -9.95 | -7.851 | 141.288 | 141.9 |
| 87.67199702491634 | -9.932 | -7.841 | 141.186 | 141.795 |
| 87.83004834510972 | -9.935 | -7.832 | 141.131 | 141.74 |
| 87.99739680178506 | -9.956 | -7.823 | 141.121 | 141.73 |
| 88.1647452584604 | -9.962 | -7.835 | 141.122 | 141.733 |
| 88.33209371513574 | -9.959 | -7.842 | 141.111 | 141.721 |
| 88.49944217181108 | -9.935 | -7.838 | 141.08 | 141.686 |
| 88.66679062848644 | -9.945 | -7.826 | 141.174 | 141.78 |
| 88.83413908516178 | -9.944 | -7.833 | 141.31 | 141.914 |
| 89.00148754183712 | -9.942 | -7.827 | 141.469 | 142.072 |
| 89.16883599851246 | -9.935 | -7.826 | 141.63 | 142.23 |
| 89.33618445518782 | -9.928 | -7.832 | 141.752 | 142.353 |
| 89.50353291186315 | -9.957 | -7.855 | 141.904 | 142.507 |
| 89.6708813685385 | -10.004 | -7.87 | 142.062 | 142.67 |
| 89.83822982521386 | -10.038 | -7.85 | 142.322 | 142.929 |
| 90.00557828188919 | -10.05 | -7.867 | 142.507 | 143.115 |
| 90.16362960208257 | -10.084 | -7.866 | 142.649 | 143.258 |
| 90.3309780587579 | -10.078 | -7.861 | 142.737 | 143.345 |
| 90.49832651543326 | -10.049 | -7.863 | 142.782 | 143.388 |
| 90.66567497210859 | -10.062 | -7.85 | 142.819 | 143.425 |
| 90.83302342878395 | -10.111 | -7.838 | 142.962 | 143.571 |
| 91.00037188545929 | -10.109 | -7.823 | 143.062 | 143.668 |
| 91.16772034213463 | -10.112 | -7.842 | 143.127 | 143.735 |
| 91.33506879880998 | -10.111 | -7.866 | 143.186 | 143.795 |
| 91.50241725548533 | -10.174 | -7.813 | 143.158 | 143.768 |
| 91.66976571216065 | -10.223 | -7.789 | 143.122 | 143.735 |
| 91.83711416883601 | -10.212 | -7.746 | 142.968 | 143.577 |
| 92.00446262551137 | -10.202 | -7.692 | 142.776 | 143.382 |
| 92.1718110821867 | -10.205 | -7.627 | 142.547 | 143.149 |
| 92.33915953886203 | -10.227 | -7.56 | 142.345 | 142.947 |
| 92.49721085905541 | -10.26 | -7.491 | 142.158 | 142.76 |
| 92.66455931573077 | -10.291 | -7.423 | 141.971 | 142.571 |
| 92.83190777240611 | -10.305 | -7.379 | 141.767 | 142.367 |
| 92.99925622908145 | -10.313 | -7.317 | 141.631 | 142.227 |
| 93.1666046857568 | -10.299 | -7.258 | 141.364 | 141.957 |
| 93.33395314243214 | -10.285 | -7.255 | 141.164 | 141.757 |
| 93.50130159910749 | -10.323 | -7.227 | 141.072 | 141.667 |
| 93.66865005578283 | -10.344 | -7.199 | 140.981 | 141.577 |
| 93.83599851245818 | -10.308 | -7.202 | 140.813 | 141.407 |
| 94.00334696913353 | -10.288 | -7.186 | 140.69 | 141.282 |
| 94.17069542580886 | -10.227 | -7.18 | 140.537 | 141.124 |
| 94.3380438824842 | -10.243 | -7.184 | 140.33 | 140.919 |
| 94.50539233915954 | -10.258 | -7.196 | 140.071 | 140.662 |
| 94.66344365935292 | -10.251 | -7.195 | 139.832 | 140.425 |
| 94.83079211602828 | -10.255 | -7.198 | 139.571 | 140.167 |
| 94.99814057270362 | -10.258 | -7.192 | 139.323 | 139.919 |
| 95.16548902937897 | -10.254 | -7.156 | 138.988 | 139.584 |
| 95.33283748605432 | -10.257 | -7.111 | 138.791 | 139.385 |
| 95.50018594272963 | -10.211 | -7.08 | 138.577 | 139.167 |
| 95.66753439940499 | -10.196 | -7.068 | 138.211 | 138.801 |
| 95.83488285608034 | -10.198 | -7.056 | 137.853 | 138.442 |
| 96.00223131275567 | -10.184 | -7.018 | 137.668 | 138.255 |
| 96.16957976943102 | -10.165 | -7.013 | 137.441 | 138.028 |
| 96.33692822610638 | -10.133 | -6.975 | 137.143 | 137.727 |
| 96.50427668278171 | -10.13 | -6.942 | 136.518 | 137.103 |
| 96.67162513945706 | -10.091 | -6.901 | 135.962 | 136.543 |
| 96.8389735961324 | -10.109 | -6.836 | 135.571 | 136.152 |
| 96.99702491632577 | -10.119 | -6.788 | 135.291 | 135.87 |
| 97.16437337300111 | -10.091 | -6.783 | 135.142 | 135.721 |
| 97.33172182967647 | -10.097 | -6.78 | 134.832 | 135.412 |
| 97.49907028635181 | -10.074 | -6.73 | 134.373 | 134.95 |
| 97.66641874302715 | -10.05 | -6.674 | 133.863 | 134.44 |
| 97.8337671997025 | -10.044 | -6.621 | 133.388 | 133.963 |
| 98.00111565637785 | -10.052 | -6.571 | 132.944 | 133.519 |
| 98.16846411305319 | -10.035 | -6.531 | 132.51 | 133.086 |
| 98.33581256972855 | -10.015 | -6.494 | 132.08 | 132.653 |
| 98.50316102640389 | -10.004 | -6.478 | 131.836 | 132.41 |
| 98.67050948307921 | -10.004 | -6.469 | 131.575 | 132.149 |
| 98.83785793975456 | -10.018 | -6.463 | 131.302 | 131.879 |
| 99.0052063964299 | -10.001 | -6.453 | 131.147 | 131.724 |
| 99.17255485310525 | -9.978 | -6.453 | 131.007 | 131.583 |
| 99.33060617329863 | -9.99 | -6.437 | 130.711 | 131.288 |
| 99.49795462997399 | -9.985 | -6.403 | 130.432 | 131.007 |
| 99.66530308664933 | -9.973 | -6.395 | 130.118 | 130.696 |
| 99.83265154332467 | -10.01 | -6.383 | 129.92 | 130.501 |
| 100.0 | -10.056 | -6.366 | 129.789 | 130.375 |